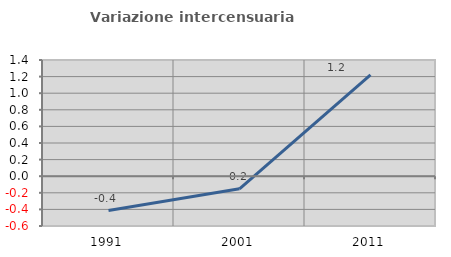
| Category | Variazione intercensuaria annua |
|---|---|
| 1991.0 | -0.414 |
| 2001.0 | -0.152 |
| 2011.0 | 1.222 |